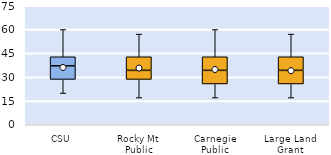
| Category | 25th | 50th | 75th |
|---|---|---|---|
| CSU | 28.571 | 8.571 | 5.714 |
| Rocky Mt Public | 28.571 | 5.714 | 8.571 |
| Carnegie Public | 25.714 | 8.571 | 8.571 |
| Large Land Grant | 25.714 | 8.571 | 8.571 |